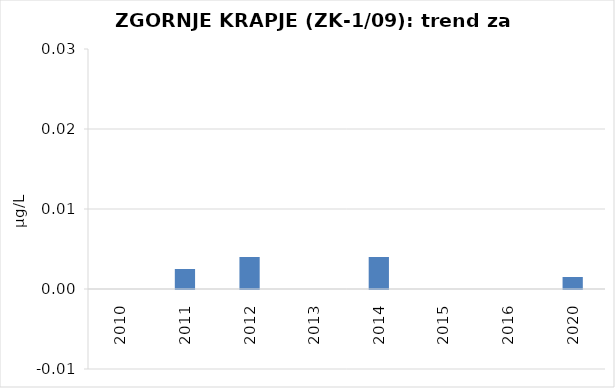
| Category | Vsota |
|---|---|
| 2010 | 0 |
| 2011 | 0.002 |
| 2012 | 0.004 |
| 2013 | 0 |
| 2014 | 0.004 |
| 2015 | 0 |
| 2016 | 0 |
| 2020 | 0.002 |